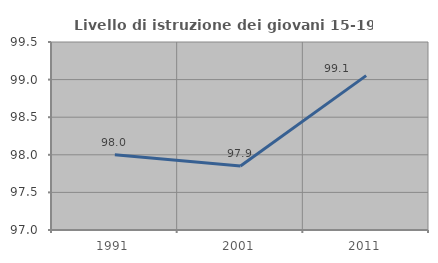
| Category | Livello di istruzione dei giovani 15-19 anni |
|---|---|
| 1991.0 | 98 |
| 2001.0 | 97.852 |
| 2011.0 | 99.053 |